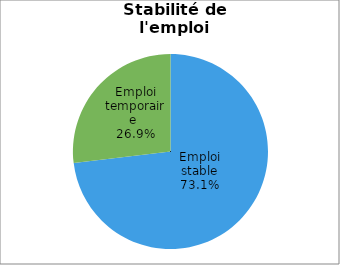
| Category | Promotion 2008 |
|---|---|
| Emploi stable | 0.731 |
| Emploi temporaire  | 0.269 |